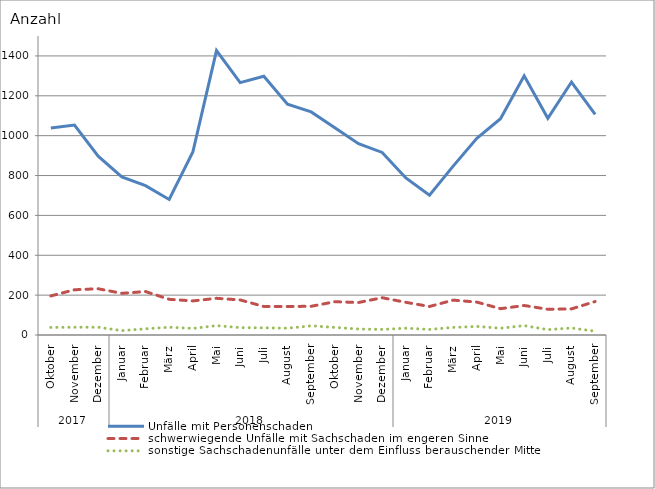
| Category | Unfälle mit Personenschaden | schwerwiegende Unfälle mit Sachschaden im engeren Sinne | sonstige Sachschadenunfälle unter dem Einfluss berauschender Mittel |
|---|---|---|---|
| 0 | 1039 | 196 | 38 |
| 1 | 1053 | 227 | 39 |
| 2 | 897 | 232 | 39 |
| 3 | 793 | 209 | 22 |
| 4 | 749 | 218 | 31 |
| 5 | 680 | 179 | 39 |
| 6 | 918 | 171 | 33 |
| 7 | 1427 | 184 | 47 |
| 8 | 1266 | 176 | 37 |
| 9 | 1298 | 143 | 36 |
| 10 | 1158 | 143 | 34 |
| 11 | 1119 | 144 | 46 |
| 12 | 1040 | 167 | 38 |
| 13 | 960 | 163 | 30 |
| 14 | 916 | 187 | 28 |
| 15 | 788 | 164 | 34 |
| 16 | 701 | 143 | 28 |
| 17 | 847 | 175 | 38 |
| 18 | 987 | 165 | 43 |
| 19 | 1085 | 132 | 34 |
| 20 | 1300 | 148 | 47 |
| 21 | 1087 | 129 | 27 |
| 22 | 1269 | 131 | 35 |
| 23 | 1107 | 168 | 19 |